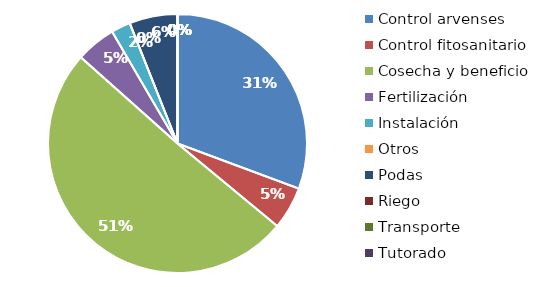
| Category | Valor |
|---|---|
| Control arvenses | 29040000 |
| Control fitosanitario | 5062500 |
| Cosecha y beneficio | 47908872 |
| Fertilización | 4725000 |
| Instalación | 2277500 |
| Otros | 0 |
| Podas | 5700000 |
| Riego | 0 |
| Transporte | 0 |
| Tutorado | 0 |